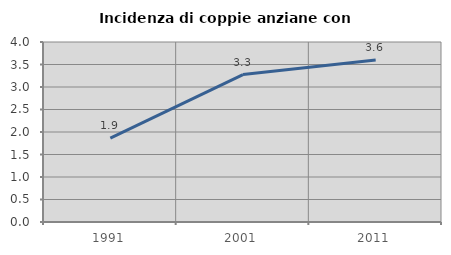
| Category | Incidenza di coppie anziane con figli |
|---|---|
| 1991.0 | 1.863 |
| 2001.0 | 3.277 |
| 2011.0 | 3.6 |